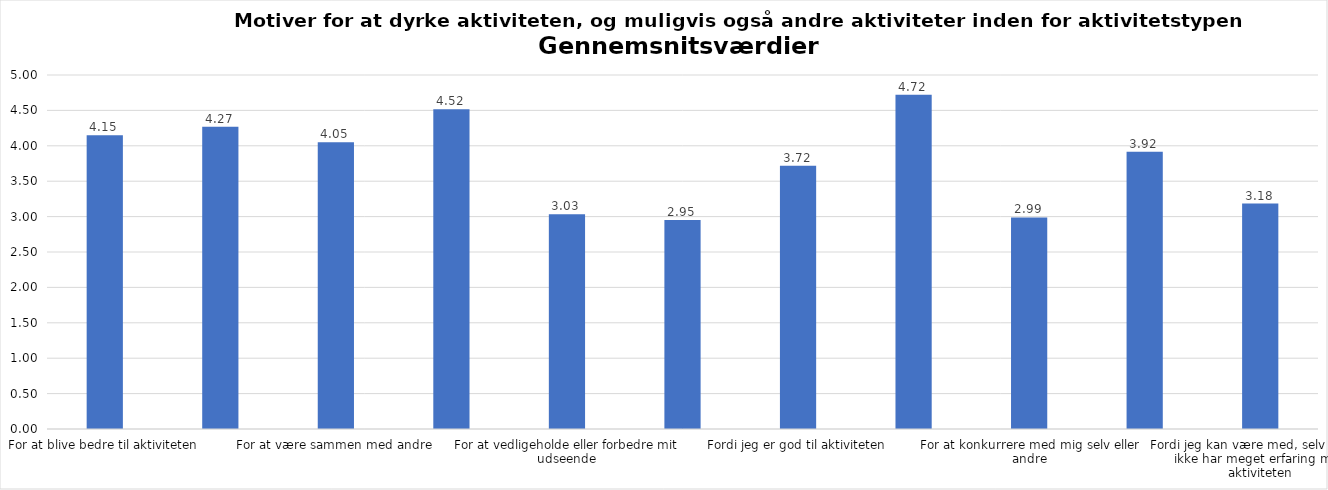
| Category | Gennemsnit |
|---|---|
| For at blive bedre til aktiviteten | 4.15 |
| For at vedligeholde eller forbedre min sundhed (fx helbred, fysisk form) | 4.271 |
| For at være sammen med andre | 4.052 |
| For at gøre noget godt for mig selv | 4.517 |
| For at vedligeholde eller forbedre mit udseende | 3.032 |
| Fordi andre i min omgangskreds opmuntrer mig til det | 2.953 |
| Fordi jeg er god til aktiviteten | 3.718 |
| Fordi jeg godt kan lide aktiviteten | 4.722 |
| For at konkurrere med mig selv eller andre | 2.989 |
| Fordi aktiviteten passer godt ind i min hverdag | 3.917 |
| Fordi jeg kan være med, selv om jeg ikke har meget erfaring med aktiviteten | 3.184 |